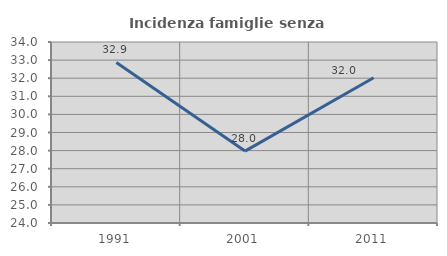
| Category | Incidenza famiglie senza nuclei |
|---|---|
| 1991.0 | 32.869 |
| 2001.0 | 27.972 |
| 2011.0 | 32.021 |